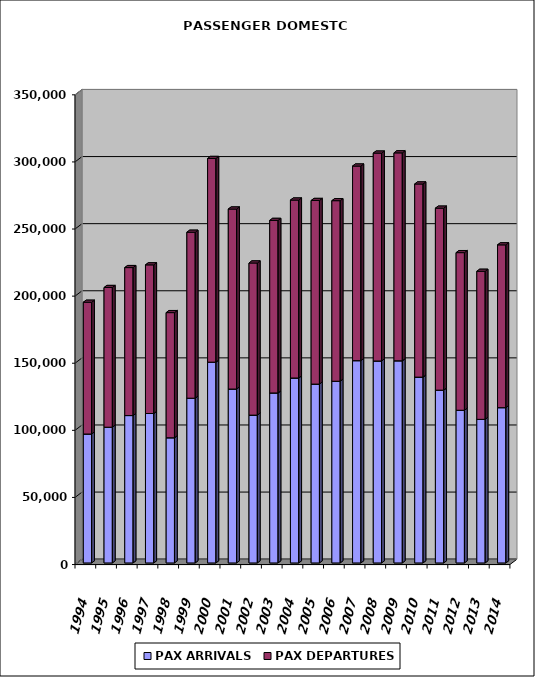
| Category | PAX ARRIVALS | PAX DEPARTURES |
|---|---|---|
| 1994.0 | 96070 | 98165 |
| 1995.0 | 101139 | 104086 |
| 1996.0 | 109810 | 110256 |
| 1997.0 | 111334 | 110761 |
| 1998.0 | 93263 | 93251 |
| 1999.0 | 122752 | 123655 |
| 2000.0 | 149610 | 151755 |
| 2001.0 | 129584 | 134108 |
| 2002.0 | 110141 | 113352 |
| 2003.0 | 126658 | 128561 |
| 2004.0 | 137800 | 132586 |
| 2005.0 | 133256 | 136822 |
| 2006.0 | 135395 | 134532 |
| 2007.0 | 150726 | 145000 |
| 2008.0 | 150484 | 154894 |
| 2009.0 | 150627 | 154927 |
| 2010.0 | 138453 | 143909 |
| 2011.0 | 128746 | 135592 |
| 2012.0 | 113755 | 117460 |
| 2013.0 | 106993 | 110306 |
| 2014.0 | 115701 | 121294 |